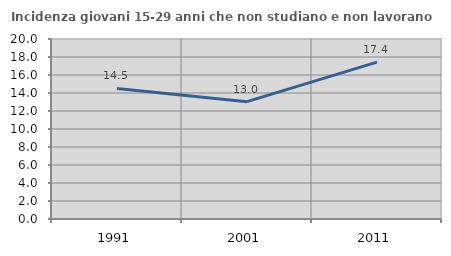
| Category | Incidenza giovani 15-29 anni che non studiano e non lavorano  |
|---|---|
| 1991.0 | 14.511 |
| 2001.0 | 13.035 |
| 2011.0 | 17.427 |